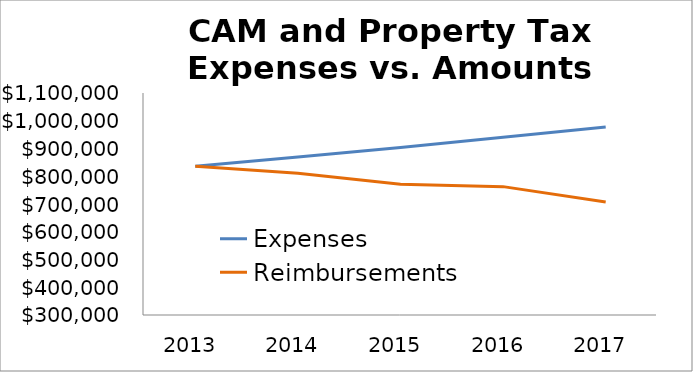
| Category | Expenses | Reimbursements |
|---|---|---|
| 2013.0 | 835796 | 835796 |
| 2014.0 | 869227.84 | 810390 |
| 2015.0 | 903996.954 | 771322 |
| 2016.0 | 940156.832 | 762576 |
| 2017.0 | 977763.105 | 707022 |